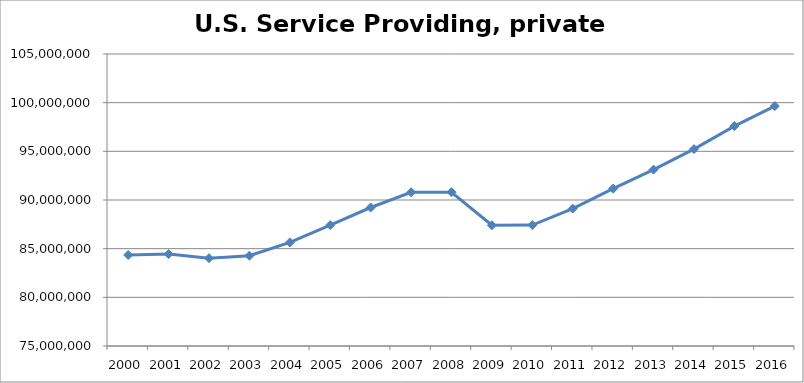
| Category | U.S. |
|---|---|
| 2000 | 84350048 |
| 2001 | 84439530 |
| 2002 | 84022667 |
| 2003 | 84277136 |
| 2004 | 85641251 |
| 2005 | 87427261 |
| 2006 | 89229270 |
| 2007 | 90789858 |
| 2008 | 90798634 |
| 2009 | 87404338 |
| 2010 | 87425645 |
| 2011 | 89119895 |
| 2012 | 91166253 |
| 2013 | 93119731 |
| 2014 | 95230436 |
| 2015 | 97591072 |
| 2016 | 99649360 |